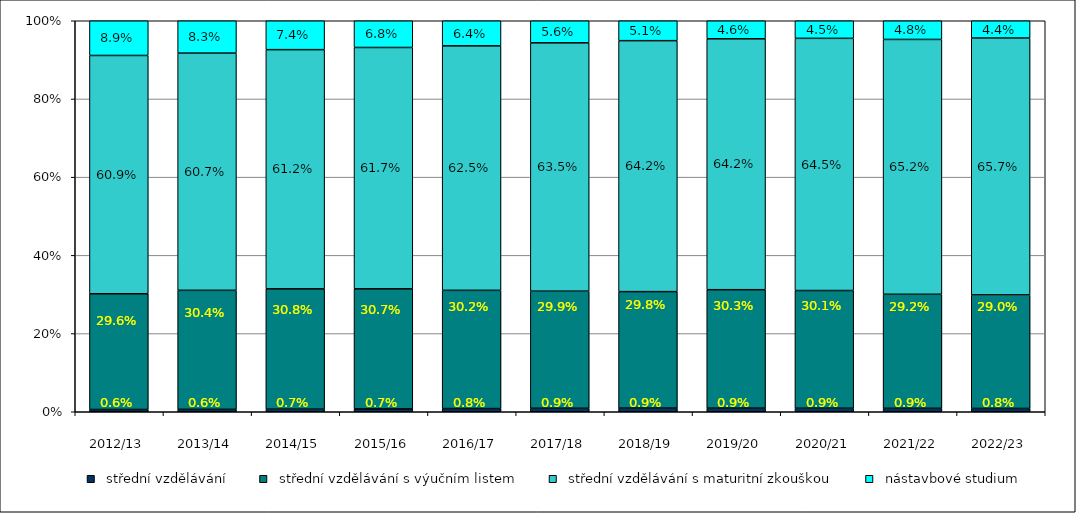
| Category |   střední vzdělávání |   střední vzdělávání s výučním listem |   střední vzdělávání s maturitní zkouškou |   nástavbové studium |
|---|---|---|---|---|
| 2012/13 | 0.006 | 0.296 | 0.609 | 0.089 |
| 2013/14 | 0.006 | 0.304 | 0.607 | 0.083 |
| 2014/15 | 0.007 | 0.308 | 0.612 | 0.074 |
| 2015/16 | 0.007 | 0.307 | 0.617 | 0.068 |
| 2016/17 | 0.008 | 0.302 | 0.625 | 0.064 |
| 2017/18 | 0.009 | 0.299 | 0.635 | 0.056 |
| 2018/19 | 0.009 | 0.298 | 0.642 | 0.051 |
| 2019/20 | 0.009 | 0.303 | 0.642 | 0.046 |
| 2020/21 | 0.009 | 0.301 | 0.645 | 0.045 |
| 2021/22 | 0.009 | 0.292 | 0.652 | 0.048 |
| 2022/23 | 0.008 | 0.29 | 0.657 | 0.044 |